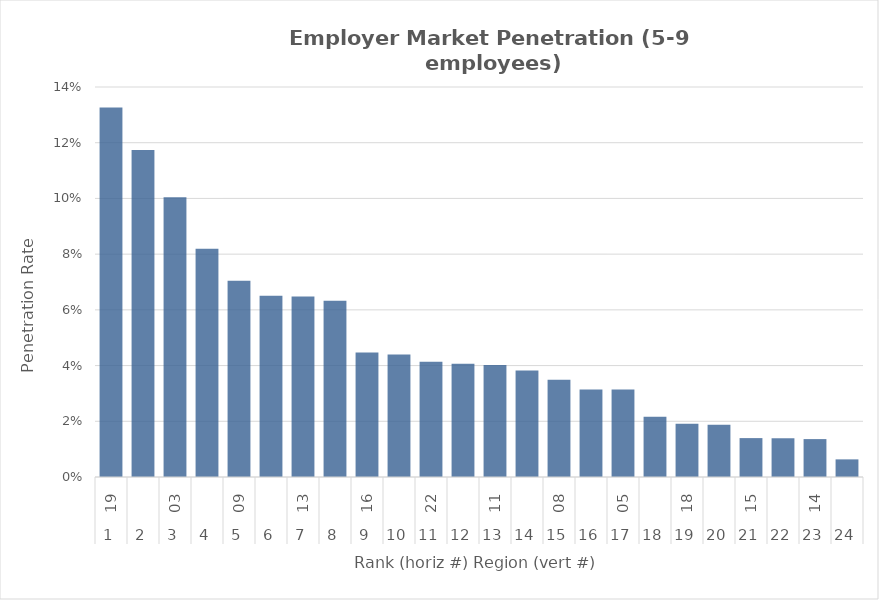
| Category | Rate |
|---|---|
| 0 | 0.133 |
| 1 | 0.117 |
| 2 | 0.1 |
| 3 | 0.082 |
| 4 | 0.07 |
| 5 | 0.065 |
| 6 | 0.065 |
| 7 | 0.063 |
| 8 | 0.045 |
| 9 | 0.044 |
| 10 | 0.041 |
| 11 | 0.041 |
| 12 | 0.04 |
| 13 | 0.038 |
| 14 | 0.035 |
| 15 | 0.031 |
| 16 | 0.031 |
| 17 | 0.022 |
| 18 | 0.019 |
| 19 | 0.019 |
| 20 | 0.014 |
| 21 | 0.014 |
| 22 | 0.014 |
| 23 | 0.006 |